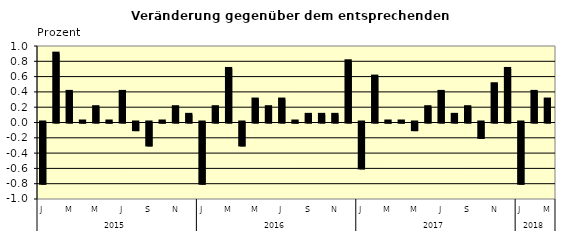
| Category | Series 0 |
|---|---|
| 0 | -0.8 |
| 1 | 0.9 |
| 2 | 0.4 |
| 3 | 0.01 |
| 4 | 0.2 |
| 5 | 0.01 |
| 6 | 0.4 |
| 7 | -0.1 |
| 8 | -0.3 |
| 9 | 0.01 |
| 10 | 0.2 |
| 11 | 0.1 |
| 12 | -0.8 |
| 13 | 0.2 |
| 14 | 0.7 |
| 15 | -0.3 |
| 16 | 0.3 |
| 17 | 0.2 |
| 18 | 0.3 |
| 19 | 0.01 |
| 20 | 0.1 |
| 21 | 0.1 |
| 22 | 0.1 |
| 23 | 0.8 |
| 24 | -0.6 |
| 25 | 0.6 |
| 26 | 0.01 |
| 27 | 0.01 |
| 28 | -0.1 |
| 29 | 0.2 |
| 30 | 0.4 |
| 31 | 0.1 |
| 32 | 0.2 |
| 33 | -0.2 |
| 34 | 0.5 |
| 35 | 0.7 |
| 36 | -0.8 |
| 37 | 0.4 |
| 38 | 0.3 |